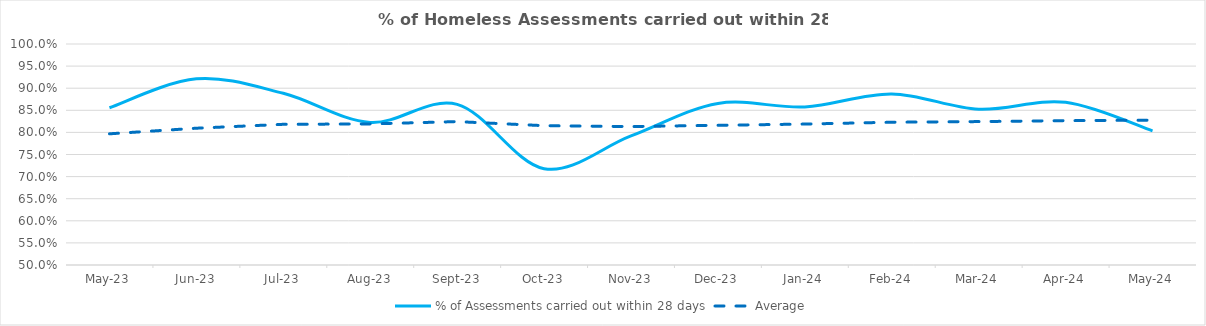
| Category | % of Assessments carried out within 28 days | Average |
|---|---|---|
| 2023-05-01 | 0.856 | 0.797 |
| 2023-06-01 | 0.921 | 0.809 |
| 2023-07-01 | 0.888 | 0.818 |
| 2023-08-01 | 0.823 | 0.819 |
| 2023-09-01 | 0.863 | 0.824 |
| 2023-10-01 | 0.718 | 0.815 |
| 2023-11-01 | 0.792 | 0.813 |
| 2023-12-01 | 0.866 | 0.816 |
| 2024-01-01 | 0.858 | 0.819 |
| 2024-02-01 | 0.887 | 0.823 |
| 2024-03-01 | 0.852 | 0.824 |
| 2024-04-01 | 0.868 | 0.827 |
| 2024-05-01 | 0.803 | 0.828 |